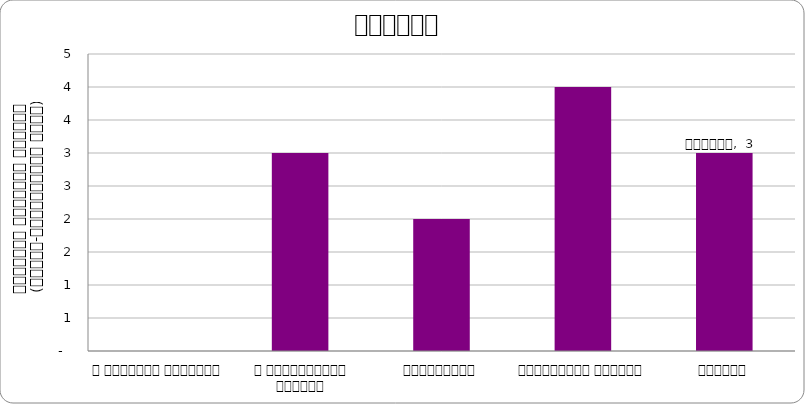
| Category | शिक्षा |
|---|---|
| द हिमालयन टाइम्स् | 0 |
| द काठमाण्डौं पोस्ट् | 3 |
| कान्तिपुर | 2 |
| अन्नपूर्ण पोस्ट् | 4 |
| नागरिक | 3 |